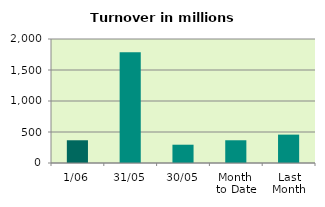
| Category | Series 0 |
|---|---|
| 1/06 | 366.741 |
| 31/05 | 1787.132 |
| 30/05 | 294.895 |
| Month 
to Date | 366.741 |
| Last
Month | 457.674 |